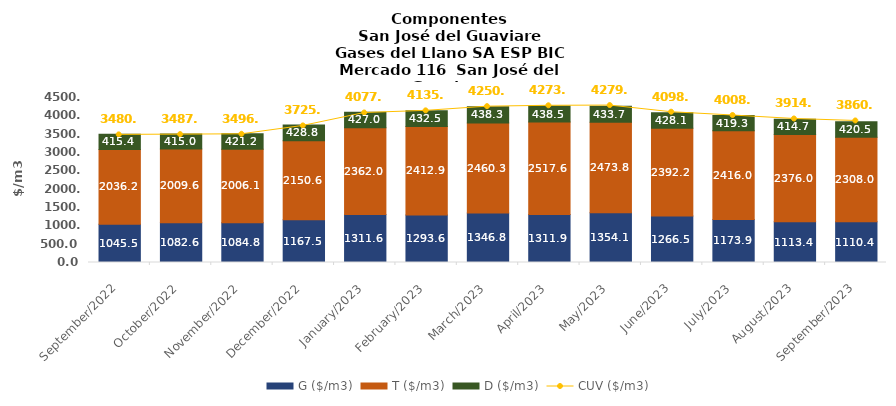
| Category | G ($/m3) | T ($/m3) | D ($/m3) |
|---|---|---|---|
| 2022-09-01 | 1045.5 | 2036.21 | 415.42 |
| 2022-10-01 | 1082.55 | 2009.58 | 414.99 |
| 2022-11-01 | 1084.79 | 2006.14 | 421.15 |
| 2022-12-01 | 1167.54 | 2150.64 | 428.78 |
| 2023-01-01 | 1311.57 | 2362.01 | 427.02 |
| 2023-02-01 | 1293.59 | 2412.88 | 432.47 |
| 2023-03-01 | 1346.83 | 2460.32 | 438.26 |
| 2023-04-01 | 1311.89 | 2517.58 | 438.54 |
| 2023-05-01 | 1354.14 | 2473.76 | 433.72 |
| 2023-06-01 | 1266.52 | 2392.24 | 428.13 |
| 2023-07-01 | 1173.91 | 2415.98 | 419.29 |
| 2023-08-01 | 1113.38 | 2375.96 | 414.65 |
| 2023-09-01 | 1110.42 | 2307.98 | 420.53 |